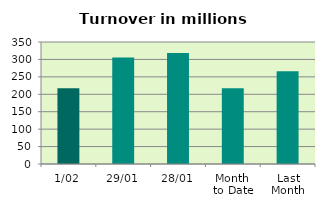
| Category | Series 0 |
|---|---|
| 1/02 | 217.466 |
| 29/01 | 305.592 |
| 28/01 | 318.633 |
| Month 
to Date | 217.466 |
| Last
Month | 265.89 |